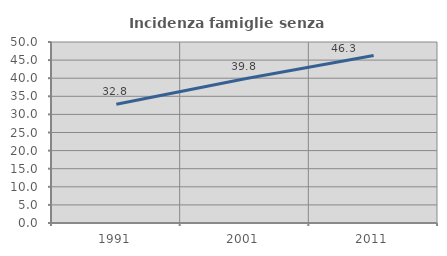
| Category | Incidenza famiglie senza nuclei |
|---|---|
| 1991.0 | 32.803 |
| 2001.0 | 39.836 |
| 2011.0 | 46.296 |